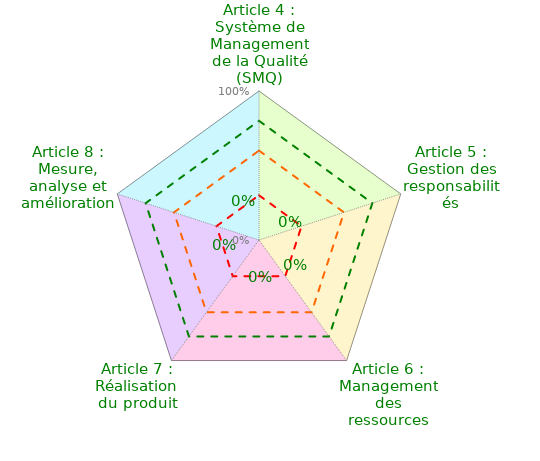
| Category | Coloriage Art4 | Coloriage Art5 | Coloriage Art6 | Coloriage Art7 | Coloriage Art8 | Conforme | Convaincant | Informel | Evaluation Mutuelle |
|---|---|---|---|---|---|---|---|---|---|
| Article 4 : Système de Management de la Qualité (SMQ) | 1 | 0 | 0 | 0 | 1 | 0.8 | 0.6 | 0.3 | 0 |
| Article 5 : Gestion des responsabilités | 1 | 1 | 0 | 0 | 0 | 0.8 | 0.6 | 0.3 | 0 |
| Article 6 : Management des ressources | 0 | 1 | 1 | 0 | 0 | 0.8 | 0.6 | 0.3 | 0 |
| Article 7 : Réalisation du produit | 0 | 0 | 1 | 1 | 0 | 0.8 | 0.6 | 0.3 | 0 |
| Article 8 : Mesure, analyse et amélioration | 0 | 0 | 0 | 1 | 1 | 0.8 | 0.6 | 0.3 | 0 |